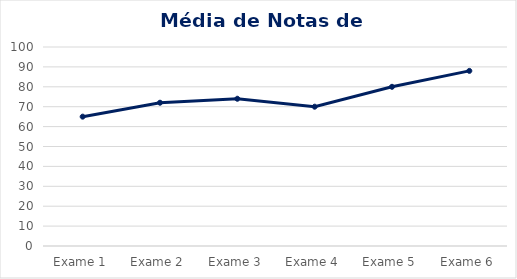
| Category | Series 0 |
|---|---|
| Exame 1 | 65 |
| Exame 2 | 72 |
| Exame 3 | 74 |
| Exame 4 | 70 |
| Exame 5 | 80 |
| Exame 6 | 88 |